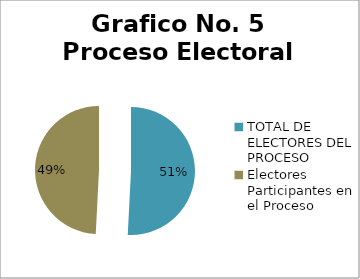
| Category | Series 0 |
|---|---|
| TOTAL DE ELECTORES DEL PROCESO | 94000000 |
| Electores Participantes en el Proceso | 91000000 |